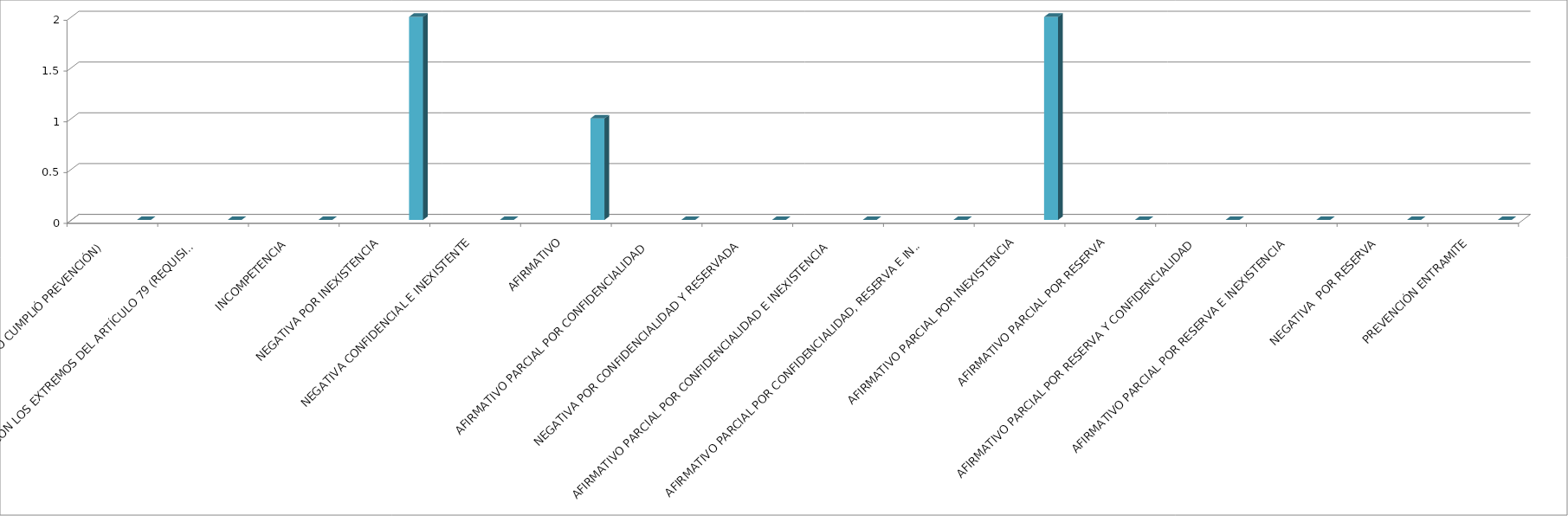
| Category | Series 0 | Series 1 | Series 2 | Series 3 | Series 4 |
|---|---|---|---|---|---|
| SE TIENE POR NO PRESENTADA ( NO CUMPLIÓ PREVENCIÓN) |  |  |  |  | 0 |
| NO CUMPLIO CON LOS EXTREMOS DEL ARTÍCULO 79 (REQUISITOS) |  |  |  |  | 0 |
| INCOMPETENCIA  |  |  |  |  | 0 |
| NEGATIVA POR INEXISTENCIA |  |  |  |  | 2 |
| NEGATIVA CONFIDENCIAL E INEXISTENTE |  |  |  |  | 0 |
| AFIRMATIVO |  |  |  |  | 1 |
| AFIRMATIVO PARCIAL POR CONFIDENCIALIDAD  |  |  |  |  | 0 |
| NEGATIVA POR CONFIDENCIALIDAD Y RESERVADA |  |  |  |  | 0 |
| AFIRMATIVO PARCIAL POR CONFIDENCIALIDAD E INEXISTENCIA |  |  |  |  | 0 |
| AFIRMATIVO PARCIAL POR CONFIDENCIALIDAD, RESERVA E INEXISTENCIA |  |  |  |  | 0 |
| AFIRMATIVO PARCIAL POR INEXISTENCIA |  |  |  |  | 2 |
| AFIRMATIVO PARCIAL POR RESERVA |  |  |  |  | 0 |
| AFIRMATIVO PARCIAL POR RESERVA Y CONFIDENCIALIDAD |  |  |  |  | 0 |
| AFIRMATIVO PARCIAL POR RESERVA E INEXISTENCIA |  |  |  |  | 0 |
| NEGATIVA  POR RESERVA |  |  |  |  | 0 |
| PREVENCIÓN ENTRAMITE |  |  |  |  | 0 |